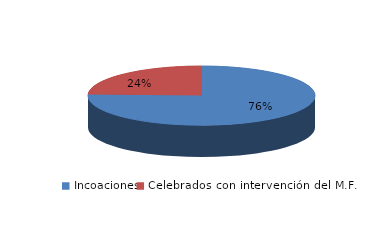
| Category | Series 0 |
|---|---|
| Incoaciones | 11464 |
| Celebrados con intervención del M.F. | 3703 |